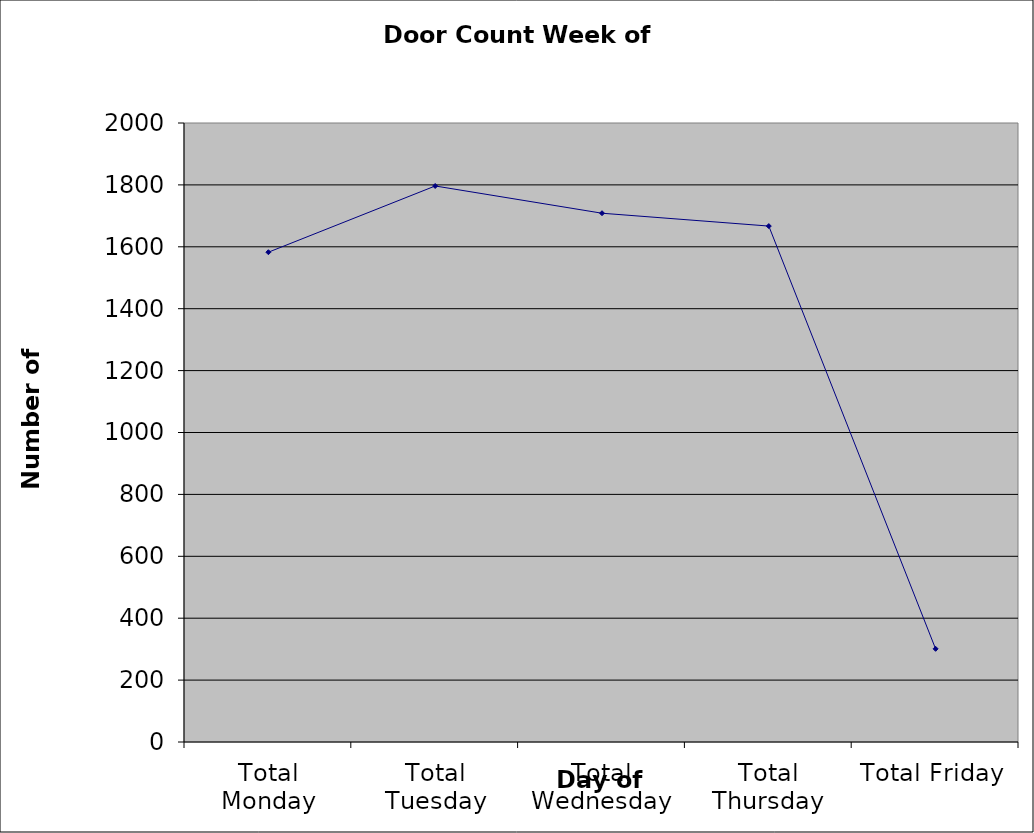
| Category | Series 0 |
|---|---|
| Total Monday | 1582.5 |
| Total Tuesday | 1796.5 |
| Total Wednesday | 1708.5 |
| Total Thursday | 1667 |
| Total Friday | 301 |